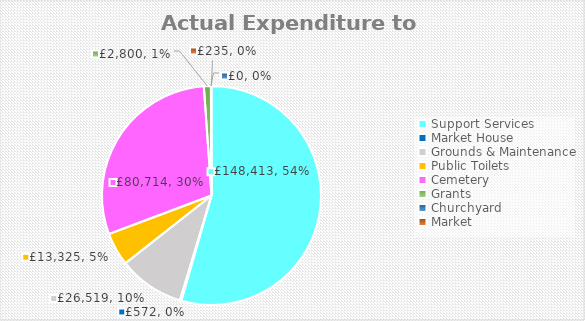
| Category | Series 0 |
|---|---|
| Support Services | 148412.67 |
| Market House | 572.37 |
| Grounds & Maintenance | 26519.46 |
| Public Toilets | 13325.03 |
| Cemetery | 80713.95 |
| Grants | 2800 |
| Churchyard | 0 |
| Market   | 235.2 |